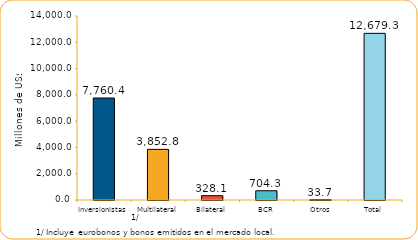
| Category | Series 1 |
|---|---|
| Inversionistas | 7760.4 |
| Multilateral | 3852.8 |
| Bilateral | 328.1 |
| BCR | 704.3 |
| Otros | 33.7 |
| Total | 12679.3 |